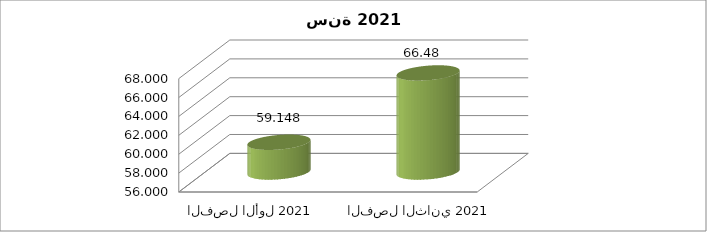
| Category | Series 0 |
|---|---|
| الفصل الأول 2021 | 59.148 |
| الفصل الثاني 2021 | 66.483 |